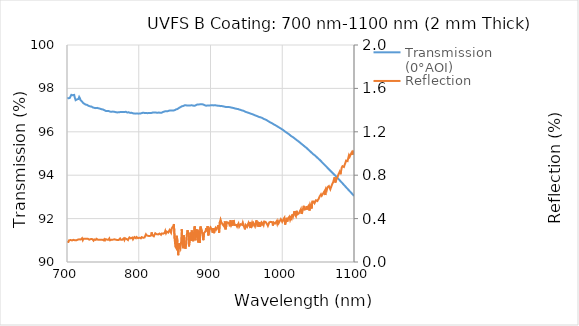
| Category | Transmission (0°AOI) |
|---|---|
| 700.0 | 97.57 |
| 701.0 | 97.53 |
| 702.0 | 97.543 |
| 703.0 | 97.575 |
| 704.0 | 97.562 |
| 705.0 | 97.579 |
| 706.0 | 97.704 |
| 707.0 | 97.718 |
| 708.0 | 97.685 |
| 709.0 | 97.731 |
| 710.0 | 97.7 |
| 711.0 | 97.562 |
| 712.0 | 97.458 |
| 713.0 | 97.469 |
| 714.0 | 97.493 |
| 715.0 | 97.504 |
| 716.0 | 97.513 |
| 717.0 | 97.605 |
| 718.0 | 97.545 |
| 719.0 | 97.454 |
| 720.0 | 97.41 |
| 721.0 | 97.397 |
| 722.0 | 97.342 |
| 723.0 | 97.311 |
| 724.0 | 97.293 |
| 725.0 | 97.261 |
| 726.0 | 97.255 |
| 727.0 | 97.248 |
| 728.0 | 97.241 |
| 729.0 | 97.214 |
| 730.0 | 97.195 |
| 731.0 | 97.188 |
| 732.0 | 97.173 |
| 733.0 | 97.171 |
| 734.0 | 97.162 |
| 735.0 | 97.14 |
| 736.0 | 97.124 |
| 737.0 | 97.112 |
| 738.0 | 97.104 |
| 739.0 | 97.083 |
| 740.0 | 97.091 |
| 741.0 | 97.095 |
| 742.0 | 97.103 |
| 743.0 | 97.091 |
| 744.0 | 97.082 |
| 745.0 | 97.071 |
| 746.0 | 97.065 |
| 747.0 | 97.05 |
| 748.0 | 97.041 |
| 749.0 | 97.03 |
| 750.0 | 97.028 |
| 751.0 | 97.017 |
| 752.0 | 96.997 |
| 753.0 | 96.966 |
| 754.0 | 96.963 |
| 755.0 | 96.959 |
| 756.0 | 96.957 |
| 757.0 | 96.959 |
| 758.0 | 96.958 |
| 759.0 | 96.952 |
| 760.0 | 96.931 |
| 761.0 | 96.935 |
| 762.0 | 96.923 |
| 763.0 | 96.926 |
| 764.0 | 96.932 |
| 765.0 | 96.922 |
| 766.0 | 96.921 |
| 767.0 | 96.914 |
| 768.0 | 96.904 |
| 769.0 | 96.894 |
| 770.0 | 96.892 |
| 771.0 | 96.91 |
| 772.0 | 96.904 |
| 773.0 | 96.911 |
| 774.0 | 96.907 |
| 775.0 | 96.906 |
| 776.0 | 96.917 |
| 777.0 | 96.916 |
| 778.0 | 96.912 |
| 779.0 | 96.909 |
| 780.0 | 96.915 |
| 781.0 | 96.922 |
| 782.0 | 96.92 |
| 783.0 | 96.911 |
| 784.0 | 96.89 |
| 785.0 | 96.894 |
| 786.0 | 96.899 |
| 787.0 | 96.885 |
| 788.0 | 96.871 |
| 789.0 | 96.883 |
| 790.0 | 96.875 |
| 791.0 | 96.872 |
| 792.0 | 96.852 |
| 793.0 | 96.846 |
| 794.0 | 96.84 |
| 795.0 | 96.842 |
| 796.0 | 96.837 |
| 797.0 | 96.827 |
| 798.0 | 96.841 |
| 799.0 | 96.84 |
| 800.0 | 96.837 |
| 801.0 | 96.85 |
| 802.0 | 96.84 |
| 803.0 | 96.857 |
| 804.0 | 96.861 |
| 805.0 | 96.865 |
| 806.0 | 96.879 |
| 807.0 | 96.868 |
| 808.0 | 96.87 |
| 809.0 | 96.865 |
| 810.0 | 96.87 |
| 811.0 | 96.863 |
| 812.0 | 96.858 |
| 813.0 | 96.866 |
| 814.0 | 96.867 |
| 815.0 | 96.867 |
| 816.0 | 96.869 |
| 817.0 | 96.856 |
| 818.0 | 96.872 |
| 819.0 | 96.882 |
| 820.0 | 96.892 |
| 821.0 | 96.887 |
| 822.0 | 96.893 |
| 823.0 | 96.884 |
| 824.0 | 96.887 |
| 825.0 | 96.879 |
| 826.0 | 96.875 |
| 827.0 | 96.879 |
| 828.0 | 96.889 |
| 829.0 | 96.89 |
| 830.0 | 96.874 |
| 831.0 | 96.865 |
| 832.0 | 96.881 |
| 833.0 | 96.891 |
| 834.0 | 96.915 |
| 835.0 | 96.918 |
| 836.0 | 96.939 |
| 837.0 | 96.941 |
| 838.0 | 96.948 |
| 839.0 | 96.95 |
| 840.0 | 96.946 |
| 841.0 | 96.97 |
| 842.0 | 96.972 |
| 843.0 | 96.986 |
| 844.0 | 96.984 |
| 845.0 | 96.986 |
| 846.0 | 96.987 |
| 847.0 | 96.975 |
| 848.0 | 96.982 |
| 849.0 | 96.988 |
| 850.0 | 96.993 |
| 851.0 | 97.012 |
| 852.0 | 97.034 |
| 853.0 | 97.049 |
| 854.0 | 97.05 |
| 855.0 | 97.076 |
| 856.0 | 97.098 |
| 857.0 | 97.119 |
| 858.0 | 97.133 |
| 859.0 | 97.149 |
| 860.0 | 97.175 |
| 861.0 | 97.188 |
| 862.0 | 97.188 |
| 863.0 | 97.199 |
| 864.0 | 97.224 |
| 865.0 | 97.229 |
| 866.0 | 97.219 |
| 867.0 | 97.215 |
| 868.0 | 97.212 |
| 869.0 | 97.219 |
| 870.0 | 97.217 |
| 871.0 | 97.209 |
| 872.0 | 97.216 |
| 873.0 | 97.233 |
| 874.0 | 97.222 |
| 875.0 | 97.207 |
| 876.0 | 97.206 |
| 877.0 | 97.201 |
| 878.0 | 97.198 |
| 879.0 | 97.206 |
| 880.0 | 97.231 |
| 881.0 | 97.255 |
| 882.0 | 97.263 |
| 883.0 | 97.27 |
| 884.0 | 97.263 |
| 885.0 | 97.253 |
| 886.0 | 97.265 |
| 887.0 | 97.27 |
| 888.0 | 97.271 |
| 889.0 | 97.266 |
| 890.0 | 97.257 |
| 891.0 | 97.243 |
| 892.0 | 97.222 |
| 893.0 | 97.21 |
| 894.0 | 97.203 |
| 895.0 | 97.21 |
| 896.0 | 97.212 |
| 897.0 | 97.2 |
| 898.0 | 97.212 |
| 899.0 | 97.222 |
| 900.0 | 97.219 |
| 901.0 | 97.221 |
| 902.0 | 97.221 |
| 903.0 | 97.222 |
| 904.0 | 97.217 |
| 905.0 | 97.227 |
| 906.0 | 97.222 |
| 907.0 | 97.22 |
| 908.0 | 97.216 |
| 909.0 | 97.205 |
| 910.0 | 97.203 |
| 911.0 | 97.204 |
| 912.0 | 97.201 |
| 913.0 | 97.193 |
| 914.0 | 97.183 |
| 915.0 | 97.182 |
| 916.0 | 97.184 |
| 917.0 | 97.171 |
| 918.0 | 97.171 |
| 919.0 | 97.168 |
| 920.0 | 97.154 |
| 921.0 | 97.143 |
| 922.0 | 97.138 |
| 923.0 | 97.138 |
| 924.0 | 97.137 |
| 925.0 | 97.144 |
| 926.0 | 97.14 |
| 927.0 | 97.122 |
| 928.0 | 97.127 |
| 929.0 | 97.115 |
| 930.0 | 97.109 |
| 931.0 | 97.108 |
| 932.0 | 97.098 |
| 933.0 | 97.098 |
| 934.0 | 97.077 |
| 935.0 | 97.071 |
| 936.0 | 97.059 |
| 937.0 | 97.057 |
| 938.0 | 97.052 |
| 939.0 | 97.042 |
| 940.0 | 97.029 |
| 941.0 | 97.021 |
| 942.0 | 97.008 |
| 943.0 | 97.001 |
| 944.0 | 96.984 |
| 945.0 | 96.981 |
| 946.0 | 96.968 |
| 947.0 | 96.95 |
| 948.0 | 96.933 |
| 949.0 | 96.916 |
| 950.0 | 96.907 |
| 951.0 | 96.899 |
| 952.0 | 96.886 |
| 953.0 | 96.874 |
| 954.0 | 96.862 |
| 955.0 | 96.849 |
| 956.0 | 96.837 |
| 957.0 | 96.821 |
| 958.0 | 96.815 |
| 959.0 | 96.802 |
| 960.0 | 96.791 |
| 961.0 | 96.772 |
| 962.0 | 96.759 |
| 963.0 | 96.75 |
| 964.0 | 96.737 |
| 965.0 | 96.721 |
| 966.0 | 96.707 |
| 967.0 | 96.693 |
| 968.0 | 96.679 |
| 969.0 | 96.673 |
| 970.0 | 96.666 |
| 971.0 | 96.653 |
| 972.0 | 96.638 |
| 973.0 | 96.624 |
| 974.0 | 96.599 |
| 975.0 | 96.582 |
| 976.0 | 96.571 |
| 977.0 | 96.555 |
| 978.0 | 96.543 |
| 979.0 | 96.524 |
| 980.0 | 96.5 |
| 981.0 | 96.478 |
| 982.0 | 96.458 |
| 983.0 | 96.443 |
| 984.0 | 96.42 |
| 985.0 | 96.407 |
| 986.0 | 96.388 |
| 987.0 | 96.366 |
| 988.0 | 96.347 |
| 989.0 | 96.328 |
| 990.0 | 96.313 |
| 991.0 | 96.293 |
| 992.0 | 96.272 |
| 993.0 | 96.254 |
| 994.0 | 96.232 |
| 995.0 | 96.214 |
| 996.0 | 96.191 |
| 997.0 | 96.172 |
| 998.0 | 96.152 |
| 999.0 | 96.132 |
| 1000.0 | 96.108 |
| 1001.0 | 96.087 |
| 1002.0 | 96.063 |
| 1003.0 | 96.03 |
| 1004.0 | 96.008 |
| 1005.0 | 95.981 |
| 1006.0 | 95.963 |
| 1007.0 | 95.945 |
| 1008.0 | 95.921 |
| 1009.0 | 95.898 |
| 1010.0 | 95.871 |
| 1011.0 | 95.845 |
| 1012.0 | 95.813 |
| 1013.0 | 95.79 |
| 1014.0 | 95.771 |
| 1015.0 | 95.746 |
| 1016.0 | 95.727 |
| 1017.0 | 95.701 |
| 1018.0 | 95.674 |
| 1019.0 | 95.65 |
| 1020.0 | 95.621 |
| 1021.0 | 95.599 |
| 1022.0 | 95.575 |
| 1023.0 | 95.547 |
| 1024.0 | 95.522 |
| 1025.0 | 95.492 |
| 1026.0 | 95.467 |
| 1027.0 | 95.441 |
| 1028.0 | 95.412 |
| 1029.0 | 95.384 |
| 1030.0 | 95.359 |
| 1031.0 | 95.334 |
| 1032.0 | 95.305 |
| 1033.0 | 95.277 |
| 1034.0 | 95.253 |
| 1035.0 | 95.218 |
| 1036.0 | 95.188 |
| 1037.0 | 95.16 |
| 1038.0 | 95.128 |
| 1039.0 | 95.096 |
| 1040.0 | 95.067 |
| 1041.0 | 95.032 |
| 1042.0 | 95.002 |
| 1043.0 | 94.977 |
| 1044.0 | 94.948 |
| 1045.0 | 94.92 |
| 1046.0 | 94.898 |
| 1047.0 | 94.871 |
| 1048.0 | 94.836 |
| 1049.0 | 94.803 |
| 1050.0 | 94.772 |
| 1051.0 | 94.743 |
| 1052.0 | 94.714 |
| 1053.0 | 94.683 |
| 1054.0 | 94.648 |
| 1055.0 | 94.616 |
| 1056.0 | 94.58 |
| 1057.0 | 94.546 |
| 1058.0 | 94.513 |
| 1059.0 | 94.478 |
| 1060.0 | 94.445 |
| 1061.0 | 94.413 |
| 1062.0 | 94.376 |
| 1063.0 | 94.341 |
| 1064.0 | 94.306 |
| 1065.0 | 94.273 |
| 1066.0 | 94.242 |
| 1067.0 | 94.207 |
| 1068.0 | 94.174 |
| 1069.0 | 94.142 |
| 1070.0 | 94.108 |
| 1071.0 | 94.076 |
| 1072.0 | 94.042 |
| 1073.0 | 94.01 |
| 1074.0 | 93.979 |
| 1075.0 | 93.943 |
| 1076.0 | 93.906 |
| 1077.0 | 93.868 |
| 1078.0 | 93.837 |
| 1079.0 | 93.804 |
| 1080.0 | 93.769 |
| 1081.0 | 93.73 |
| 1082.0 | 93.694 |
| 1083.0 | 93.659 |
| 1084.0 | 93.625 |
| 1085.0 | 93.588 |
| 1086.0 | 93.553 |
| 1087.0 | 93.516 |
| 1088.0 | 93.48 |
| 1089.0 | 93.443 |
| 1090.0 | 93.405 |
| 1091.0 | 93.37 |
| 1092.0 | 93.336 |
| 1093.0 | 93.301 |
| 1094.0 | 93.264 |
| 1095.0 | 93.229 |
| 1096.0 | 93.193 |
| 1097.0 | 93.156 |
| 1098.0 | 93.12 |
| 1099.0 | 93.085 |
| 1100.0 | 93.046 |